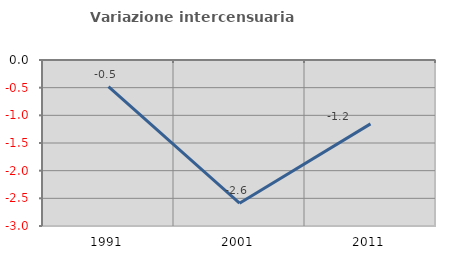
| Category | Variazione intercensuaria annua |
|---|---|
| 1991.0 | -0.483 |
| 2001.0 | -2.588 |
| 2011.0 | -1.155 |